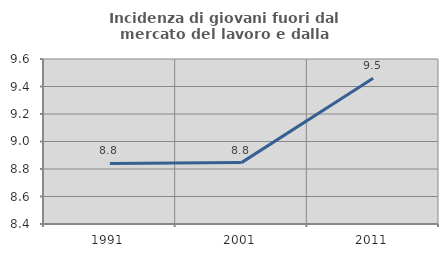
| Category | Incidenza di giovani fuori dal mercato del lavoro e dalla formazione  |
|---|---|
| 1991.0 | 8.84 |
| 2001.0 | 8.846 |
| 2011.0 | 9.459 |